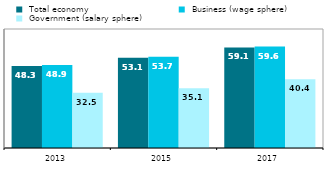
| Category |  Total economy |  Business (wage sphere) |  Government (salary sphere) |
|---|---|---|---|
| 2013.0 | 48.282 | 48.874 | 32.481 |
| 2015.0 | 53.075 | 53.662 | 35.077 |
| 2017.0 | 59.139 | 59.643 | 40.44 |